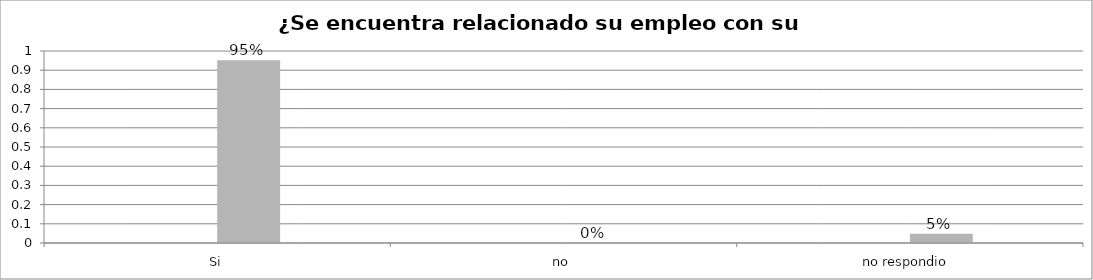
| Category | Series 0 | Series 1 | Series 2 | Series 3 |
|---|---|---|---|---|
| Si |  |  | 0.952 |  |
| no  |  |  | 0 |  |
| no respondio  |  |  | 0.048 |  |